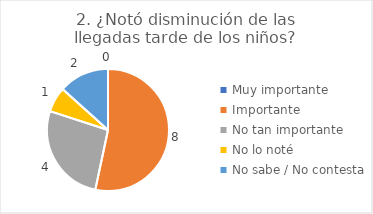
| Category | 2. ¿Notó disminución de las llegadas tarde de los niños? |
|---|---|
| Muy importante  | 0 |
| Importante  | 0.533 |
| No tan importante  | 0.267 |
| No lo noté  | 0.067 |
| No sabe / No contesta | 0.133 |